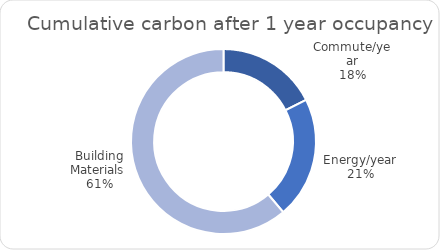
| Category | Series 0 |
|---|---|
| Commute/year | 0.176 |
| Energy/year | 0.213 |
| Building Materials  | 0.612 |